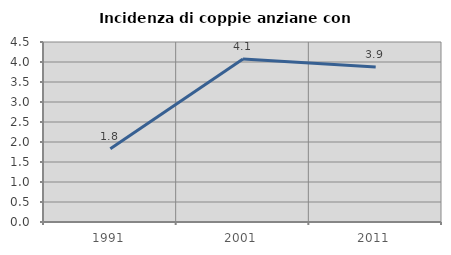
| Category | Incidenza di coppie anziane con figli |
|---|---|
| 1991.0 | 1.833 |
| 2001.0 | 4.076 |
| 2011.0 | 3.875 |